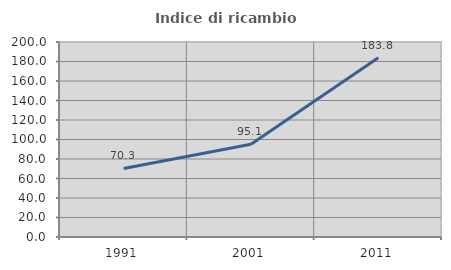
| Category | Indice di ricambio occupazionale  |
|---|---|
| 1991.0 | 70.338 |
| 2001.0 | 95.056 |
| 2011.0 | 183.773 |